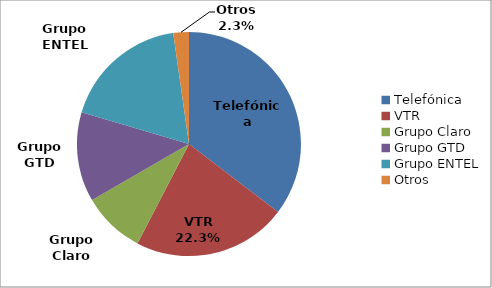
| Category | Series 0 |
|---|---|
| Telefónica | 888186 |
| VTR | 558553 |
| Grupo Claro | 226744 |
| Grupo GTD | 324380 |
| Grupo ENTEL | 456578 |
| Otros | 56531 |